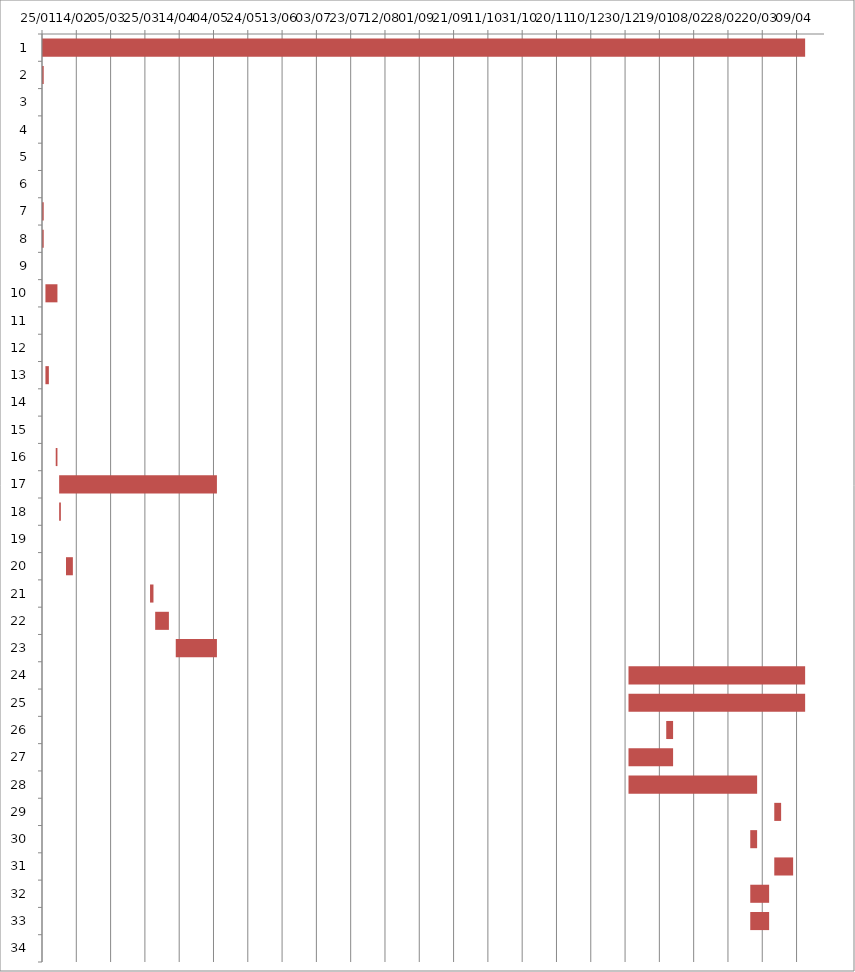
| Category | Fecha de inicio | DURACIÓN |
|---|---|---|
| 0 | 1/25/16 | 445 |
| 1 | 1/25/16 | 1 |
| 2 | 1/25/16 | 0 |
| 3 | 1/25/16 | 0 |
| 4 | 1/25/16 | 0 |
| 5 | 1/25/16 | 0 |
| 6 | 1/25/16 | 1 |
| 7 | 1/25/16 | 1 |
| 8 | 1/26/16 | 0 |
| 9 | 1/27/16 | 7 |
| 10 | 1/27/16 | 0 |
| 11 | 1/28/16 | 0 |
| 12 | 1/27/16 | 2 |
| 13 | 2/1/16 | 0 |
| 14 | 2/2/16 | 0 |
| 15 | 2/2/16 | 1 |
| 16 | 2/4/16 | 92 |
| 17 | 2/4/16 | 1 |
| 18 | 2/5/16 | 0 |
| 19 | 2/8/16 | 4 |
| 20 | 3/28/16 | 2 |
| 21 | 3/31/16 | 8 |
| 22 | 4/12/16 | 24 |
| 23 | 1/1/17 | 103 |
| 24 | 1/1/17 | 103 |
| 25 | 1/23/17 | 4 |
| 26 | 1/1/17 | 26 |
| 27 | 1/1/17 | 75 |
| 28 | 3/27/17 | 4 |
| 29 | 3/13/17 | 4 |
| 30 | 3/27/17 | 11 |
| 31 | 3/13/17 | 11 |
| 32 | 3/13/17 | 11 |
| 33 | 4/14/17 | 0 |